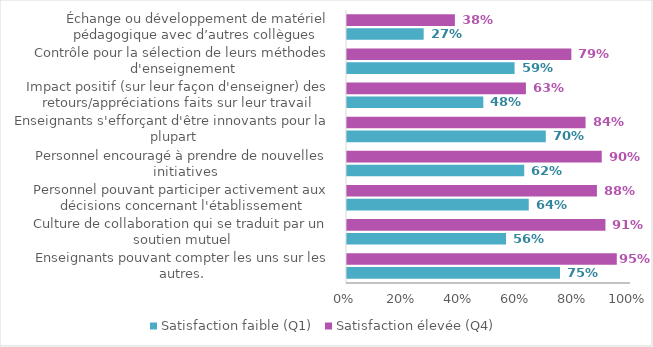
| Category | Satisfaction faible (Q1) | Satisfaction élevée (Q4) |
|---|---|---|
| Enseignants pouvant compter les uns sur les autres.  | 0.75 | 0.95 |
| Culture de collaboration qui se traduit par un soutien mutuel | 0.56 | 0.91 |
| Personnel pouvant participer activement aux décisions concernant l'établissement | 0.64 | 0.88 |
| Personnel encouragé à prendre de nouvelles initiatives | 0.624 | 0.897 |
| Enseignants s'efforçant d'être innovants pour la plupart | 0.7 | 0.84 |
| Impact positif (sur leur façon d'enseigner) des retours/appréciations faits sur leur travail | 0.48 | 0.63 |
| Contrôle pour la sélection de leurs méthodes d'enseignement | 0.59 | 0.79 |
| Échange ou développement de matériel pédagogique avec d’autres collègues  | 0.27 | 0.38 |